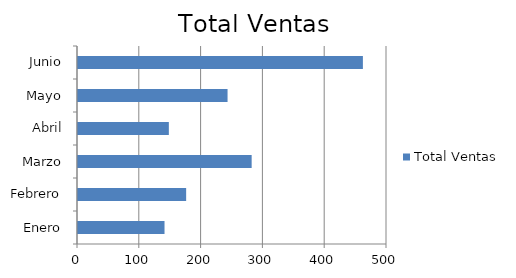
| Category | Total Ventas |
|---|---|
| Enero | 140 |
| Febrero | 175 |
| Marzo | 281 |
| Abril | 147 |
| Mayo | 242 |
| Junio | 461 |